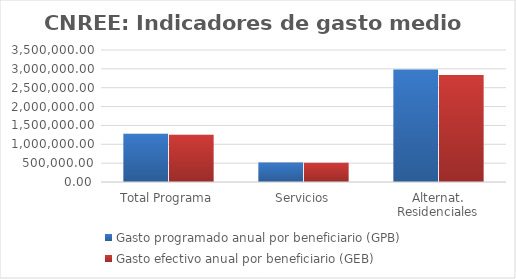
| Category | Gasto programado anual por beneficiario (GPB)  | Gasto efectivo anual por beneficiario (GEB)  |
|---|---|---|
| Total Programa | 1277858.806 | 1251960.777 |
| Servicios | 516699.104 | 509369.205 |
| Alternat. Residenciales | 2986093.657 | 2837639.966 |